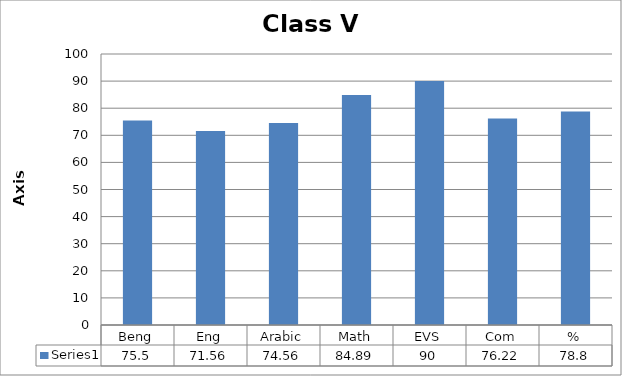
| Category | Series 0 |
|---|---|
| Beng | 75.5 |
| Eng | 71.56 |
| Arabic | 74.56 |
| Math | 84.89 |
| EVS | 90 |
| Com | 76.22 |
| % | 78.8 |